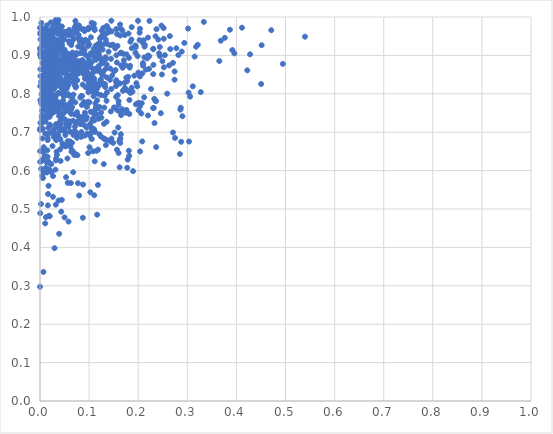
| Category | Series 0 |
|---|---|
| 0.02709339771973407 | 0.755 |
| 0.02919782494659373 | 0.9 |
| 0.019098560578344803 | 0.898 |
| 0.009769669985578378 | 0.853 |
| 0.12694486622733547 | 0.849 |
| 0.12307414921914317 | 0.835 |
| 0.05187580481836729 | 0.699 |
| 0.0022544420249364094 | 0.776 |
| 0.014412276318506612 | 0.884 |
| 0.16867731172009504 | 0.808 |
| 0.102453721973088 | 0.544 |
| 0.06273196589625474 | 0.779 |
| 0.11403467699599146 | 0.889 |
| 0.16303013367379726 | 0.827 |
| 0.04923019206028134 | 0.822 |
| 0.0565354215919146 | 0.568 |
| 0.13341325776617863 | 0.895 |
| 0.0028744440868859744 | 0.786 |
| 0.034628058617515944 | 0.884 |
| 0.01051965445953651 | 0.853 |
| 0.014802896093945916 | 0.867 |
| 0.24424519701399017 | 0.898 |
| 0.049699672776679193 | 0.805 |
| 0.2818783786407679 | 0.901 |
| 0.005272598988521171 | 0.848 |
| 0.16453571070721262 | 0.97 |
| 0.02339808887279604 | 0.902 |
| 0.05923938166201559 | 0.728 |
| 0.3958550662742336 | 0.905 |
| 0.02424673691549739 | 0.855 |
| 0.16982489682673674 | 0.874 |
| 0.01177397462870966 | 0.968 |
| 0.09064904564124887 | 0.914 |
| 0.05516373010496556 | 0.953 |
| 0.046722606790103205 | 0.87 |
| 0.09391386826680914 | 0.843 |
| 0.11403406665059812 | 0.765 |
| 0.12900729912132014 | 0.972 |
| 0.08857768157685264 | 0.881 |
| 0.14549971681441365 | 0.683 |
| 0.01333966573535672 | 0.859 |
| 0.007949702283796656 | 0.908 |
| 0.0959710604056705 | 0.899 |
| 0.27086380161296086 | 0.699 |
| 0.00374830509983215 | 0.737 |
| 0.28487046675355554 | 0.643 |
| 0.4503471412212373 | 0.825 |
| 0.10743712231293934 | 0.854 |
| 0.038036861424385005 | 0.845 |
| 0.07078637719848757 | 0.885 |
| 0.1007132603645099 | 0.778 |
| 0.17736096485620223 | 0.833 |
| 0.026894716689953246 | 0.772 |
| 0.03548337598382856 | 0.851 |
| 0.16962406557791643 | 0.904 |
| 0.11553414027931241 | 0.86 |
| 0.1015999415002663 | 0.691 |
| 0.21253644545633243 | 0.895 |
| 0.07391978848538605 | 0.85 |
| 0.0845984090116989 | 0.724 |
| 0.029700350001178988 | 0.898 |
| 0.10903925143601623 | 0.704 |
| 0.09038472342998616 | 0.718 |
| 0.022991745536764974 | 0.617 |
| 0.12108606961137625 | 0.766 |
| 0.03996931809558324 | 0.726 |
| 0.07388829661105345 | 0.725 |
| 0.03381276415761858 | 0.902 |
| 0.01056363269838878 | 0.947 |
| 0.11244391041751833 | 0.759 |
| 0.00807088202543349 | 0.805 |
| 0.004454347206124698 | 0.586 |
| 0.017082843750759635 | 0.712 |
| 0.06862340452647353 | 0.896 |
| 0.25427476648973246 | 0.901 |
| 0.037690040714096096 | 0.522 |
| 0.029038508561477605 | 0.888 |
| 0.01600131932279958 | 0.509 |
| 0.045391085861709146 | 0.749 |
| 0.09764095079667601 | 0.898 |
| 0.02300322932754484 | 0.856 |
| 0.0446568582827962 | 0.813 |
| 0.0019734494989177565 | 0.513 |
| 0.04453008149617166 | 0.765 |
| 0.01700265546580948 | 0.89 |
| 0.005869579046529738 | 0.817 |
| 0.18022641442579024 | 0.808 |
| 0.1944894272839217 | 0.921 |
| 0.10557470591370188 | 0.883 |
| 0.20270340491844352 | 0.94 |
| 0.0050459204705853855 | 0.709 |
| 0.06587121334364221 | 0.781 |
| 0.15477638942081717 | 0.82 |
| 0.08470826978790424 | 0.907 |
| 0.11390256887812245 | 0.81 |
| 0.016196968992961303 | 0.906 |
| 0.08705719581973681 | 0.88 |
| 0.05513013464794625 | 0.877 |
| 0.05885069029413792 | 0.937 |
| 0.08756361393717249 | 0.852 |
| 0.09806014049819634 | 0.646 |
| 0.0067272354843167514 | 0.759 |
| 0.057238353285699706 | 0.824 |
| 0.009192570064351813 | 0.966 |
| 0.059502164738279406 | 0.966 |
| 0.07534926135534759 | 0.752 |
| 0.23639949203860755 | 0.781 |
| 0.17978934719367679 | 0.844 |
| 0.1159467073414574 | 0.745 |
| 0.17698629067385363 | 0.842 |
| 0.01142279762359999 | 0.856 |
| 0.03537704236919892 | 0.86 |
| 0.15084241546552113 | 0.859 |
| 0.2348958595460886 | 0.782 |
| 0.10624879417559108 | 0.904 |
| 0.07320256288935367 | 0.979 |
| 0.064142124352224 | 0.649 |
| 0.04073545414227575 | 0.719 |
| 0.025934082896891808 | 0.955 |
| 0.1952756957422872 | 0.773 |
| 0.08866826369455383 | 0.968 |
| 0.11136248338954013 | 0.702 |
| 0.05575956068798271 | 0.866 |
| 0.03210561250418986 | 0.84 |
| 0.09102841615203039 | 0.865 |
| 0.03287739888305308 | 0.721 |
| 0.015323609051449139 | 0.926 |
| 0.12504693454790472 | 0.738 |
| 0.15703592363890295 | 0.955 |
| 0.09571157450755508 | 0.878 |
| 0.16005637529451067 | 0.646 |
| 0.135557828814579 | 0.68 |
| 0.07196666055258527 | 0.84 |
| 0.05396406990952585 | 0.859 |
| 0.19878749460028367 | 0.898 |
| 0.12776567435685193 | 0.85 |
| 0.025545147831883663 | 0.926 |
| 0.07608283009363981 | 0.726 |
| 0.0993627729828348 | 0.829 |
| 0.02779937079461192 | 0.706 |
| 0.044256081879416986 | 0.935 |
| 0.02233566029229117 | 0.843 |
| 0.002902472250138066 | 0.9 |
| 0.07535289470632467 | 0.685 |
| 0.23095146209303052 | 0.875 |
| 0.02171194679929145 | 0.966 |
| 0.06997643677023635 | 0.897 |
| 0.012983071209530794 | 0.798 |
| 0.39167593084401675 | 0.914 |
| 0.04748955918112552 | 0.832 |
| 0.061282649015659385 | 0.891 |
| 0.024463820533095815 | 0.786 |
| 0.047153984557974926 | 0.874 |
| 0.1634378259734216 | 0.672 |
| 0.011391869426940038 | 0.868 |
| 0.00875364551193114 | 0.903 |
| 0.10245532067245122 | 0.843 |
| 0.11701104156235753 | 0.8 |
| 0.014613772436301464 | 0.773 |
| 0.04218848180281454 | 0.732 |
| 0.07871978293561499 | 0.946 |
| 0.026896284386595304 | 0.968 |
| 0.047910001735920416 | 0.895 |
| 0.08451043152157456 | 0.941 |
| 0.0004762309273289578 | 0.623 |
| 0.01401704103309187 | 0.875 |
| 0.026717580712363742 | 0.879 |
| 0.08662566885183354 | 0.909 |
| 0.0814573542076642 | 0.935 |
| 0.005984844108365972 | 0.581 |
| 0.04849625251990142 | 0.75 |
| 0.12310331122857154 | 0.92 |
| 0.10376278036117981 | 0.947 |
| 0.02762009746051286 | 0.873 |
| 0.008171291106429557 | 0.765 |
| 0.0003830557164284931 | 0.651 |
| 0.10934157746435125 | 0.917 |
| 0.0032693160283081557 | 0.626 |
| 0.1116516426069647 | 0.701 |
| 0.006822371386673298 | 0.817 |
| 0.013517685364670351 | 0.746 |
| 0.0040831788626432 | 0.756 |
| 0.16390957970039965 | 0.906 |
| 0.031144977761504933 | 0.754 |
| 0.1128277870076686 | 0.775 |
| 0.2750023943006509 | 0.685 |
| 0.11172464177711694 | 0.829 |
| 0.03299953266138489 | 0.966 |
| 0.09853511172845353 | 0.804 |
| 0.12114279175383258 | 0.897 |
| 0.009370115806859425 | 0.84 |
| 0.4514378632409034 | 0.927 |
| 0.04140547492061675 | 0.968 |
| 0.020328067251049853 | 0.953 |
| 0.05308074975839516 | 0.583 |
| 0.029966940993220503 | 0.854 |
| 0.11497108817404922 | 0.652 |
| 0.16249154336158922 | 0.681 |
| 0.16310459936063126 | 0.98 |
| 0.1096957384986611 | 0.807 |
| 0.00826117152222594 | 0.897 |
| 0.03652842870684958 | 0.981 |
| 0.03630361705942653 | 0.969 |
| 0.1299284697361257 | 0.617 |
| 0.14458862687883434 | 0.891 |
| 0.17228618773225024 | 0.829 |
| 0.021057375567435144 | 0.898 |
| 0.0992690261563548 | 0.972 |
| 0.2094886471288222 | 0.933 |
| 0.12017819032476396 | 0.822 |
| 0.00928980486923825 | 0.932 |
| 0.031137383421602993 | 0.942 |
| 0.08450235274150764 | 0.794 |
| 0.020623037796756005 | 0.777 |
| 0.04698044515210975 | 0.782 |
| 0.15657125902022462 | 0.881 |
| 0.23655585679478597 | 0.661 |
| 0.20367486126073675 | 0.969 |
| 0.150687148662631 | 0.764 |
| 0.025207901913848474 | 0.882 |
| 0.10356217121716282 | 0.823 |
| 0.04472172235324756 | 0.927 |
| 0.002162105901878042 | 0.831 |
| 0.1097348378571068 | 0.982 |
| 0.02675643121113702 | 0.974 |
| 0.1084988386249589 | 0.84 |
| 0.05876332223891312 | 0.795 |
| 0.21093428465155217 | 0.939 |
| 0.12427730241827817 | 0.89 |
| 0.12514429754392375 | 0.826 |
| 0.03274885911274006 | 0.836 |
| 0.008777755551125477 | 0.87 |
| 0.42788189063574134 | 0.903 |
| 0.04605095771266943 | 0.776 |
| 0.1647216051079431 | 0.695 |
| 0.19445978871954073 | 0.907 |
| 0.03052801578276021 | 0.794 |
| 0.10007731612370607 | 0.814 |
| 0.006079977489984123 | 0.829 |
| 0.07166564063172476 | 0.905 |
| 0.007482914526719675 | 0.957 |
| 0.11983941724217106 | 0.905 |
| 0.10053623690225921 | 0.825 |
| 0.0230278953463412 | 0.748 |
| 0.1310159947867926 | 0.764 |
| 0.06289468613489624 | 0.758 |
| 0.01574046683059771 | 0.746 |
| 0.010422696695496225 | 0.741 |
| 0.183974630956101 | 0.802 |
| 0.0757850151231233 | 0.904 |
| 0.03742779227375781 | 0.927 |
| 0.04633208895201124 | 0.664 |
| 0.1574109981594548 | 0.757 |
| 0.16749464036643447 | 0.76 |
| 0.09477333541057498 | 0.868 |
| 0.06517635078437323 | 0.672 |
| 0.04756810853105797 | 0.854 |
| 0.015548781462295214 | 0.685 |
| 0.06764139352430876 | 0.596 |
| 0.1652889372539743 | 0.874 |
| 0.04367630436674852 | 0.828 |
| 0.020000754072235116 | 0.857 |
| 0.11802916325767643 | 0.563 |
| 0.183420828859583 | 0.873 |
| 0.035880523931559605 | 0.962 |
| 0.20820645556034068 | 0.676 |
| 0.05823021245952442 | 0.845 |
| 0.010987344733312865 | 0.784 |
| 0.02212080884717338 | 0.792 |
| 0.3058028122891864 | 0.793 |
| 0.01836364406153712 | 0.815 |
| 0.06820262220974693 | 0.693 |
| 0.20964772845167134 | 0.873 |
| 0.07982804541511923 | 0.941 |
| 0.14344012070357082 | 0.926 |
| 0.07272001345869938 | 0.859 |
| 0.27762655542122716 | 0.919 |
| 0.09770945516404006 | 0.924 |
| 0.051195558452035606 | 0.893 |
| 0.03926856237198462 | 0.83 |
| 0.02692392018900558 | 0.937 |
| 0.01960809994311785 | 0.759 |
| 0.008378144411616217 | 0.95 |
| 0.010574553136691867 | 0.697 |
| 0.08217081282094674 | 0.79 |
| 0.1744680664146705 | 0.81 |
| 0.017125377142443332 | 0.818 |
| 0.0595795637966271 | 0.962 |
| 0.013303734559156122 | 0.842 |
| 0.014377777664437152 | 0.866 |
| 0.07854691384047219 | 0.953 |
| 0.012870026505556131 | 0.762 |
| 0.18212174506078238 | 0.784 |
| 0.0179732412439082 | 0.935 |
| 0.021442983562636964 | 0.699 |
| 0.10232502485136352 | 0.883 |
| 0.011507426121673991 | 0.727 |
| 0.030268702295828565 | 0.912 |
| 0.12021061025742386 | 0.873 |
| 0.0516793639480535 | 0.692 |
| 0.17761350073652604 | 0.607 |
| 0.024749338689628808 | 0.858 |
| 0.007773907713249151 | 0.861 |
| 0.05930120191637556 | 0.721 |
| 0.09314670168714045 | 0.817 |
| 0.20030297427207178 | 0.855 |
| 0.05043496187058616 | 0.829 |
| 0.03803277173152109 | 0.913 |
| 0.13968900362993952 | 0.91 |
| 0.03287083139273239 | 0.797 |
| 0.0006179422217065245 | 0.82 |
| 0.07573139664923412 | 0.697 |
| 0.16826219946607557 | 0.868 |
| 0.0077547124770220854 | 0.661 |
| 0.13958279295921572 | 0.968 |
| 0.0007247169922326435 | 0.784 |
| 0.15670476741655315 | 0.655 |
| 0.04342294526765178 | 0.742 |
| 0.029181822968134763 | 0.931 |
| 0.2133622165443062 | 0.927 |
| 0.045119386576799814 | 0.886 |
| 0.09085740424367894 | 0.963 |
| 0.056974085930369234 | 0.903 |
| 0.006996106950427405 | 0.952 |
| 0.057503599676998585 | 0.826 |
| 0.005257564412823323 | 0.709 |
| 0.1862440298489194 | 0.941 |
| 0.17275870723151743 | 0.953 |
| 0.03171965219897055 | 0.793 |
| 0.06726570956764832 | 0.873 |
| 0.1598775092714324 | 0.771 |
| 0.03361585180119486 | 0.834 |
| 0.08678726853650953 | 0.968 |
| 0.050790269663401943 | 0.734 |
| 0.1635126156884391 | 0.952 |
| 0.2939596263331655 | 0.932 |
| 0.0008043677764947299 | 0.864 |
| 0.051251282754213645 | 0.819 |
| 0.007786657398885732 | 0.841 |
| 0.022073951819260418 | 0.776 |
| 0.0025120384859361744 | 0.722 |
| 0.0403909615640029 | 0.706 |
| 0.31494356516320776 | 0.897 |
| 0.12752416447266124 | 0.915 |
| 0.03335623485322581 | 0.846 |
| 0.03885282761477005 | 0.742 |
| 0.07283972895951496 | 0.722 |
| 0.042585631311772176 | 0.889 |
| 0.08772786825973877 | 0.564 |
| 0.018019834938132306 | 0.805 |
| 0.032178011155283404 | 0.875 |
| 0.074611402176886 | 0.834 |
| 0.12593403395236846 | 0.882 |
| 0.1432002419357632 | 0.866 |
| 0.02408893644186383 | 0.85 |
| 0.0009657550883159782 | 0.846 |
| 0.01599414955732914 | 0.912 |
| 0.03549161421057945 | 0.931 |
| 0.01170579331889643 | 0.909 |
| 0.06728696900618647 | 0.73 |
| 0.04286523204969139 | 0.857 |
| 0.0026341085473692294 | 0.903 |
| 0.007335480213925938 | 0.797 |
| 0.04357387916014055 | 0.911 |
| 0.07165759032826435 | 0.849 |
| 0.15542604463015697 | 0.969 |
| 0.005886002264764989 | 0.65 |
| 0.09536219630759557 | 0.877 |
| 0.059533822847407825 | 0.9 |
| 0.05082046403749341 | 0.796 |
| 0.026396134123419457 | 0.532 |
| 0.013686950149945809 | 0.621 |
| 0.20294865680015584 | 0.959 |
| 0.010645693002356627 | 0.923 |
| 0.057136002831421284 | 0.848 |
| 0.026067510312482556 | 0.795 |
| 0.0895481800761635 | 0.743 |
| 0.005364795007273493 | 0.94 |
| 0.11257300289051075 | 0.746 |
| 0.056347485715674384 | 0.883 |
| 0.016255088994314493 | 0.938 |
| 0.1359067272408433 | 0.876 |
| 0.05249788932932076 | 0.723 |
| 0.007489939289082814 | 0.879 |
| 0.18679958860137624 | 0.974 |
| 0.1086573148963893 | 0.975 |
| 0.10506092466123429 | 0.711 |
| 0.05763821958235238 | 0.823 |
| 0.03352186789812517 | 0.924 |
| 0.035608075005697626 | 0.821 |
| 0.2867136222959805 | 0.764 |
| 0.039112766779364816 | 0.94 |
| 0.010012416234684851 | 0.742 |
| 0.1753632766421227 | 0.753 |
| 0.09157737383844888 | 0.751 |
| 0.066307609768953 | 0.652 |
| 0.10910128640550487 | 0.827 |
| 0.23060104410100268 | 0.851 |
| 0.01496985661666983 | 0.763 |
| 0.00593828480096914 | 0.809 |
| 0.10025499190621634 | 0.888 |
| 0.03206443549189397 | 0.714 |
| 0.13636667145432713 | 0.804 |
| 0.20390151058035233 | 0.65 |
| 0.051958590257192294 | 0.86 |
| 0.003565938076421249 | 0.743 |
| 0.03812201267469162 | 0.683 |
| 0.17442310806571615 | 0.751 |
| 0.028476994522586896 | 0.687 |
| 0.0065196218632027625 | 0.813 |
| 0.06625866082431309 | 0.907 |
| 0.010358656658919774 | 0.875 |
| 0.11844804118507879 | 0.655 |
| 0.012790480602598353 | 0.802 |
| 0.11746311668748655 | 0.928 |
| 0.2875732492574602 | 0.675 |
| 0.2741985158423417 | 0.858 |
| 0.07643839045259004 | 0.859 |
| 0.046374119379700485 | 0.749 |
| 0.005318032732056999 | 0.934 |
| 0.06218522417982819 | 0.662 |
| 0.03766835420856507 | 0.757 |
| 0.03601597685401081 | 0.987 |
| 0.13276233037722518 | 0.818 |
| 0.08322611816707404 | 0.793 |
| 0.07963579073863669 | 0.535 |
| 0.06530543576389225 | 0.851 |
| 0.17076471255871006 | 0.887 |
| 0.04852343588748931 | 0.892 |
| 0.007013027049329712 | 0.336 |
| 0.16171716402594216 | 0.676 |
| 0.018987999752430373 | 0.842 |
| 0.028490140315448165 | 0.7 |
| 0.13670007044010346 | 0.93 |
| 0.008570764789868623 | 0.864 |
| 0.1740873222025351 | 0.874 |
| 0.3026413169234802 | 0.803 |
| 0.1304119661852936 | 0.956 |
| 0.08935707095877576 | 0.778 |
| 0.019175969961189643 | 0.944 |
| 0.1549540232643586 | 0.792 |
| 0.1963310601521402 | 0.828 |
| 0.10815144875544236 | 0.865 |
| 0.12564964250602662 | 0.964 |
| 0.06895137900265158 | 0.943 |
| 0.08600518037225202 | 0.888 |
| 0.1442243105435166 | 0.754 |
| 0.004976222681291942 | 0.684 |
| 0.07425676952024785 | 0.885 |
| 0.0256727996068149 | 0.789 |
| 0.21296692903221204 | 0.923 |
| 0.303543675523701 | 0.676 |
| 0.11640446753629652 | 0.485 |
| 0.08549520120252041 | 0.794 |
| 0.025487106540431403 | 0.947 |
| 0.12408516807741221 | 0.797 |
| 0.0015734476523167062 | 0.896 |
| 0.03445244906885225 | 0.641 |
| 0.07075945545824991 | 0.88 |
| 0.1240315988329923 | 0.838 |
| 0.11870532549900203 | 0.867 |
| 0.08169875070420018 | 0.721 |
| 0.015439632880574039 | 0.961 |
| 0.07101938699637267 | 0.746 |
| 0.09606112938235789 | 0.969 |
| 0.007422111084135374 | 0.595 |
| 0.03343606065800886 | 0.686 |
| 0.21822187033757157 | 0.892 |
| 0.12763544290245443 | 0.827 |
| 0.06117182416254596 | 0.9 |
| 0.13587981473022137 | 0.843 |
| 0.00680837309168858 | 0.836 |
| 0.03284558729954179 | 0.863 |
| 0.004129320574412398 | 0.942 |
| 0.015929291830642733 | 0.858 |
| 0.11040506319646437 | 0.84 |
| 0.23062707876489974 | 0.916 |
| 0.04978620844713 | 0.915 |
| 0.016370827085055994 | 0.539 |
| 0.14584604535848233 | 0.962 |
| 0.08371986337621062 | 0.688 |
| 0.10548657980593135 | 0.985 |
| 0.11143723374656977 | 0.966 |
| 0.01697752611955483 | 0.855 |
| 0.11006734035472365 | 0.804 |
| 0.10890503659941841 | 0.794 |
| 0.17861940283647215 | 0.629 |
| 0.07714650243723586 | 0.853 |
| 0.12937122188205208 | 0.885 |
| 0.044482485527768234 | 0.705 |
| 0.18672474563547603 | 0.816 |
| 0.049000143139165675 | 0.902 |
| 0.04895618828591897 | 0.942 |
| 0.09736583736406146 | 0.779 |
| 0.0002086409149185675 | 0.709 |
| 0.032224953150626345 | 0.511 |
| 0.10310441357160582 | 0.753 |
| 0.058343555610306574 | 0.755 |
| 0.26527426832627754 | 0.917 |
| 0.11947092669094861 | 0.916 |
| 0.046427130409213646 | 0.868 |
| 0.11065523006510902 | 0.97 |
| 0.0628563375226664 | 0.568 |
| 0.015504609873109532 | 0.636 |
| 0.15318695111412206 | 0.918 |
| 0.11376349506762085 | 0.866 |
| 0.03710106132713753 | 0.694 |
| 0.0033155606722186093 | 0.773 |
| 0.15930254245404996 | 0.712 |
| 0.13559874330529786 | 0.727 |
| 0.07738748061246092 | 0.567 |
| 0.0072026363475236055 | 0.793 |
| 0.024340047573608525 | 0.963 |
| 0.06448303757712404 | 0.935 |
| 0.0003181325277197278 | 0.919 |
| 0.060892439398455456 | 0.701 |
| 0.05411999786402333 | 0.843 |
| 0.08489403008328589 | 0.721 |
| 0.10204301410260808 | 0.721 |
| 0.07736591269250659 | 0.863 |
| 0.01883177906475575 | 0.82 |
| 0.13182573529379793 | 0.795 |
| 0.2708218764316198 | 0.881 |
| 0.03151802780619273 | 0.893 |
| 0.029732938516332075 | 0.777 |
| 0.023376511574846437 | 0.596 |
| 0.0679159125671609 | 0.702 |
| 0.009554890296923135 | 0.64 |
| 0.33370336041338755 | 0.987 |
| 0.008479886805057957 | 0.809 |
| 0.25213824141252617 | 0.943 |
| 0.2887356785278269 | 0.91 |
| 0.18028317903762603 | 0.957 |
| 0.022937649627089773 | 0.844 |
| 0.12919641439413743 | 0.929 |
| 0.5396570800021636 | 0.949 |
| 0.05797172150098029 | 0.848 |
| 0.08209871364840671 | 0.861 |
| 0.023428130638069256 | 0.887 |
| 0.14890969329222092 | 0.672 |
| 0.13025127798214864 | 0.722 |
| 0.31112784431728524 | 0.819 |
| 0.05088600126067533 | 0.961 |
| 0.05961220564777514 | 0.831 |
| 0.0032763122393196786 | 0.798 |
| 0.09461727755967853 | 0.877 |
| 0.03791180818078066 | 0.957 |
| 0.0337143088108931 | 0.649 |
| 0.01972620450406648 | 0.807 |
| 0.08693296192163191 | 0.824 |
| 0.038890774090617364 | 0.922 |
| 0.03499555458349923 | 0.885 |
| 0.007823675176188316 | 0.829 |
| 0.04135940640853586 | 0.682 |
| 0.011607182798688997 | 0.83 |
| 0.16032250601574405 | 0.827 |
| 0.22249562185441896 | 0.898 |
| 0.017960961478733828 | 0.775 |
| 0.004331584009620415 | 0.967 |
| 0.20970361818296834 | 0.88 |
| 0.19457521758227747 | 0.924 |
| 0.1484007654367484 | 0.928 |
| 0.10258195722778873 | 0.9 |
| 0.03815799167923084 | 0.873 |
| 0.27404743797629416 | 0.837 |
| 0.11348135267827175 | 0.925 |
| 0.10939845375623547 | 0.835 |
| 0.008995964424581726 | 0.759 |
| 0.06110589697920632 | 0.676 |
| 0.027334075734523955 | 0.878 |
| 0.3213516854817333 | 0.928 |
| 0.05640980892732861 | 0.677 |
| 0.026610851208327513 | 0.772 |
| 0.09405289724944033 | 0.771 |
| 0.09594250466302734 | 0.855 |
| 0.10062221312124409 | 0.876 |
| 0.053100196325124416 | 0.867 |
| 0.035818420269379425 | 0.871 |
| 0.04575819828724126 | 0.767 |
| 0.20030234904858457 | 0.777 |
| 0.028130707556350942 | 0.899 |
| 0.0005711898458551357 | 0.489 |
| 0.003958575511900597 | 0.801 |
| 0.03759615349262313 | 0.992 |
| 0.03471560763168924 | 0.766 |
| 0.011924920734743494 | 0.607 |
| 0.022287438110776714 | 0.799 |
| 0.02660025222700435 | 0.81 |
| 0.06649421123888577 | 0.949 |
| 0.005016951950854054 | 0.82 |
| 0.13959249981790822 | 0.96 |
| 0.22622566128554855 | 0.812 |
| 0.23731622269352326 | 0.968 |
| 0.05838231542088956 | 0.714 |
| 0.012264293006326699 | 0.739 |
| 0.047595431983418646 | 0.899 |
| 0.054897901927410064 | 0.771 |
| 0.0821953673753727 | 0.906 |
| 0.13413418909833164 | 0.941 |
| 0.0971492662639093 | 0.937 |
| 0.38679693263458226 | 0.967 |
| 0.1650860997772552 | 0.745 |
| 0.09769117844240627 | 0.839 |
| 0.01736614001983039 | 0.56 |
| 0.17623832769285885 | 0.758 |
| 0.03894966107074904 | 0.435 |
| 0.01658582474322301 | 0.696 |
| 0.03667503337201783 | 0.93 |
| 0.06807854159232307 | 0.798 |
| 0.21996484435422525 | 0.946 |
| 0.1425422288185222 | 0.836 |
| 0.018655473704160985 | 0.603 |
| 0.3178652138308905 | 0.923 |
| 0.1233422525938963 | 0.945 |
| 0.10346652624462505 | 0.906 |
| 0.1452026786763948 | 0.813 |
| 0.07384816007816353 | 0.903 |
| 0.15851339492625183 | 0.797 |
| 0.008377596159139578 | 0.863 |
| 0.004198309500190178 | 0.773 |
| 0.05975637360782726 | 0.954 |
| 0.024180027752906508 | 0.749 |
| 0.051053110022362236 | 0.863 |
| 0.18829449121066155 | 0.806 |
| 0.29007988376569205 | 0.742 |
| 0.19961520340488537 | 0.99 |
| 0.07209974464478797 | 0.99 |
| 0.0752775884770468 | 0.836 |
| 0.13553221122071923 | 0.782 |
| 0.09250122480544898 | 0.941 |
| 0.1123811239673217 | 0.908 |
| 0.06148790510895652 | 0.668 |
| 0.030683607532028256 | 0.894 |
| 0.08977874802788444 | 0.734 |
| 0.03313859204112035 | 0.679 |
| 0.09970492074652704 | 0.969 |
| 0.13008592024560606 | 0.683 |
| 0.07623330948334717 | 0.64 |
| 0.012136140827675113 | 0.814 |
| 0.07978199850679513 | 0.969 |
| 0.07113902054449006 | 0.715 |
| 0.05037684695172018 | 0.799 |
| 0.036543334868740174 | 0.835 |
| 0.09609233398196404 | 0.696 |
| 0.18094591820927064 | 0.652 |
| 0.02836290610534775 | 0.883 |
| 0.06663873182878066 | 0.844 |
| 0.18162291771857964 | 0.638 |
| 0.050719928679435755 | 0.911 |
| 0.42215286846515077 | 0.861 |
| 0.06167622241187454 | 0.869 |
| 0.004866747617702449 | 0.929 |
| 0.022124741656177283 | 0.81 |
| 0.23166545334904542 | 0.763 |
| 0.09450367902668133 | 0.862 |
| 0.016927270461678634 | 0.624 |
| 0.04570824596578926 | 0.671 |
| 0.18959352111705452 | 0.599 |
| 0.06372052161677733 | 0.927 |
| 0.01829705229231071 | 0.482 |
| 0.0144750720070147 | 0.834 |
| 0.00217892650175322 | 0.605 |
| 0.014505560351995017 | 0.782 |
| 0.04191369231930797 | 0.625 |
| 0.08217753334863998 | 0.971 |
| 0.024976883782381276 | 0.856 |
| 0.18696319627782243 | 0.919 |
| 0.131681758549003 | 0.682 |
| 0.010636631164009147 | 0.463 |
| 0.04100918193847647 | 0.842 |
| 0.111999445095461 | 0.894 |
| 0.49453633543015507 | 0.878 |
| 0.009974482478318225 | 0.886 |
| 0.11634548810139544 | 0.762 |
| 0.06539849434440015 | 0.765 |
| 0.2629963231621756 | 0.874 |
| 0.0779731775593745 | 0.885 |
| 0.47099469691183626 | 0.966 |
| 0.11959684740267651 | 0.735 |
| 0.049480941920730825 | 0.829 |
| 0.0075626815578380135 | 0.899 |
| 0.23520744466605836 | 0.95 |
| 0.08773959013389043 | 0.885 |
| 0.1166367283561649 | 0.815 |
| 0.04688394805061458 | 0.871 |
| 0.03141511671071506 | 0.603 |
| 0.05805803228775697 | 0.467 |
| 0.07925817132127089 | 0.978 |
| 0.08385873478914829 | 0.92 |
| 0.1323198022190898 | 0.825 |
| 0.1600020408154389 | 0.781 |
| 0.015122728330381197 | 0.921 |
| 0.05182536808412841 | 0.76 |
| 0.14529490517522003 | 0.99 |
| 0.26448656967166495 | 0.95 |
| 0.06642198533989474 | 0.9 |
| 0.036919016323594955 | 0.753 |
| 0.25904813465352106 | 0.8 |
| 0.21000877862207723 | 0.876 |
| 0.11767488836045703 | 0.907 |
| 0.03843106842730604 | 0.801 |
| 0.0853778125718081 | 0.771 |
| 0.16800721954309228 | 0.965 |
| 0.029630048051568103 | 0.398 |
| 0.03020383943188798 | 0.985 |
| 0.1627414162014107 | 0.754 |
| 0.12922555156287108 | 0.859 |
| 0.13488468703253653 | 0.958 |
| 0.0949323142415156 | 0.739 |
| 0.1244872841435235 | 0.751 |
| 0.1004660806046257 | 0.846 |
| 0.03385779527151922 | 0.865 |
| 0.1324140658551245 | 0.89 |
| 0.044510609449053606 | 0.975 |
| 0.0005433550022071465 | 0.915 |
| 0.021802182414406013 | 0.833 |
| 0.19206333429882205 | 0.847 |
| 0.014686969147965745 | 0.935 |
| 0.039929256038423455 | 0.777 |
| 0.03245605506055471 | 0.87 |
| 0.05673008892228237 | 0.962 |
| 0.18125015235666997 | 0.894 |
| 0.029882983072616498 | 0.868 |
| 0.21583500904657882 | 0.863 |
| 0.134750983699357 | 0.892 |
| 0.029635207214284698 | 0.815 |
| 0.05147076397424699 | 0.889 |
| 0.21992201310089277 | 0.743 |
| 0.026796246605567786 | 0.944 |
| 0.06045441511007099 | 0.866 |
| 0.06997909960911008 | 0.852 |
| 0.09170755037500489 | 0.903 |
| 0.036760192426790406 | 0.802 |
| 0.017300777020664238 | 0.794 |
| 0.17632924260589566 | 0.903 |
| 0.2200732846799468 | 0.9 |
| 0.08899317223020942 | 0.774 |
| 0.00014108078512897748 | 0.902 |
| 0.021475081841692667 | 0.822 |
| 0.0408832835046361 | 0.655 |
| 0.10992575973232765 | 0.708 |
| 0.02935252635012009 | 0.907 |
| 0.1083794093593452 | 0.75 |
| 0.07369948854872943 | 0.819 |
| 0.008255223140427037 | 0.796 |
| 0.07778802217659864 | 0.853 |
| 0.14351482524841153 | 0.676 |
| 0.08009929141280658 | 0.737 |
| 0.0036399476650005314 | 0.626 |
| 0.2121543632478745 | 0.791 |
| 0.08630721624749127 | 0.86 |
| 0.04264142218295497 | 0.951 |
| 0.01706159522844597 | 0.75 |
| 0.2220562074285496 | 0.865 |
| 0.0011090391439819713 | 0.942 |
| 0.07296168509127021 | 0.643 |
| 0.005846344716475382 | 0.97 |
| 0.03227969537634956 | 0.784 |
| 0.18665527141017924 | 0.804 |
| 0.0026617727125453072 | 0.984 |
| 0.04979556428697629 | 0.71 |
| 0.04323863721730459 | 0.493 |
| 0.03459694756306353 | 0.899 |
| 0.15493794451040233 | 0.831 |
| 0.10549326479717513 | 0.682 |
| 0.020429577934280574 | 0.802 |
| 0.08648339903905722 | 0.92 |
| 0.005374883194746993 | 0.927 |
| 0.08418665691786698 | 0.701 |
| 0.018786244943656882 | 0.756 |
| 0.12151945216720361 | 0.827 |
| 0.11141864527535694 | 0.624 |
| 0.10227196834193675 | 0.877 |
| 0.017589548814813782 | 0.873 |
| 0.13095970558431091 | 0.951 |
| 0.01496753462267586 | 0.799 |
| 0.12132435169610778 | 0.933 |
| 0.023192228487166178 | 0.866 |
| 0.02216169372706034 | 0.879 |
| 0.07094111079042975 | 0.822 |
| 0.02727069341501398 | 0.928 |
| 0.05179432329661282 | 0.905 |
| 0.04258499360805135 | 0.77 |
| 0.041554680448939396 | 0.721 |
| 0.054515445818329455 | 0.888 |
| 0.019849845888963435 | 0.922 |
| 0.3681821908307624 | 0.938 |
| 0.025567837730724907 | 0.873 |
| 0.06574087061068123 | 0.651 |
| 0.05414811636154704 | 0.841 |
| 0.01426155285258246 | 0.978 |
| 0.0053530530783094665 | 0.738 |
| 0.1003090872525304 | 0.928 |
| 0.04687228768194107 | 0.772 |
| 0.23058842469796814 | 0.917 |
| 0.020603930866675113 | 0.952 |
| 0.11059823806908031 | 0.749 |
| 0.013447581581336299 | 0.792 |
| 0.03210745138952675 | 0.888 |
| 0.08187139957440182 | 0.731 |
| 0.0996882083215801 | 0.851 |
| 0.1072049885147166 | 0.829 |
| 0.13429793906094956 | 0.865 |
| 0.06632438386761053 | 0.843 |
| 0.03602006868438057 | 0.882 |
| 0.10412614145866061 | 0.869 |
| 0.001546123825394985 | 0.971 |
| 0.07789370946604202 | 0.743 |
| 0.010713424815127048 | 0.968 |
| 0.12091560594186401 | 0.694 |
| 0.18204797371058 | 0.747 |
| 0.03963370045364867 | 0.884 |
| 0.18252743700387553 | 0.868 |
| 0.03754614074597262 | 0.917 |
| 0.01395326435715627 | 0.828 |
| 0.10431342473689276 | 0.713 |
| 0.032606858083334966 | 0.882 |
| 0.03473805361932647 | 0.932 |
| 0.006497380666603991 | 0.63 |
| 0.0910666419266769 | 0.691 |
| 8.824941851948154e-06 | 0.298 |
| 0.0010827029577276104 | 0.955 |
| 0.018337231579109603 | 0.83 |
| 0.04952702882989757 | 0.914 |
| 0.04122769759744238 | 0.771 |
| 0.0206058234437545 | 0.813 |
| 0.1638274021406163 | 0.684 |
| 0.006742661492080693 | 0.879 |
| 0.04829728883985007 | 0.961 |
| 0.12708574108991055 | 0.88 |
| 0.05478069481096859 | 0.864 |
| 0.2492897703774235 | 0.885 |
| 0.1093199289589577 | 0.805 |
| 0.3016624459551983 | 0.97 |
| 0.20072335583375012 | 0.757 |
| 0.029644675461023784 | 0.692 |
| 0.1044571244144541 | 0.7 |
| 0.15380545275631896 | 0.862 |
| 0.06935873243810509 | 0.838 |
| 0.01770502968393539 | 0.765 |
| 0.20352649460743855 | 0.767 |
| 0.025457622968571125 | 0.664 |
| 0.044058934942725836 | 0.836 |
| 0.07082875420682455 | 0.969 |
| 0.059507128350015814 | 0.903 |
| 0.004672039627213964 | 0.97 |
| 0.2229937942211736 | 0.99 |
| 0.07006134492509553 | 0.965 |
| 0.06983707798908956 | 0.64 |
| 0.051828093353090576 | 0.665 |
| 0.04428455739200665 | 0.821 |
| 0.03385327561261575 | 0.824 |
| 0.19418144814623695 | 0.926 |
| 0.2517752247420073 | 0.971 |
| 0.10802447308407559 | 0.65 |
| 0.03240652597963478 | 0.627 |
| 0.03621162799047095 | 0.957 |
| 0.06032538545400756 | 0.932 |
| 0.3651858269506395 | 0.885 |
| 0.16503341419772077 | 0.907 |
| 0.009346919161445144 | 0.886 |
| 0.02237116484644397 | 0.781 |
| 0.06656593151698187 | 0.847 |
| 0.055310741931534846 | 0.824 |
| 0.07675176015077945 | 0.744 |
| 0.04425860926311487 | 0.884 |
| 0.07695762922407134 | 0.726 |
| 0.03171116276201125 | 0.776 |
| 0.02385104555597084 | 0.915 |
| 0.1256574827614806 | 0.95 |
| 0.07156241882199099 | 0.703 |
| 0.03152172625056904 | 0.992 |
| 0.010484428345524432 | 0.948 |
| 0.0204725609290346 | 0.831 |
| 0.0133162445133308 | 0.836 |
| 0.06307804685310059 | 0.879 |
| 0.05775887406208158 | 0.799 |
| 0.0779498940358937 | 0.923 |
| 0.0973867481167946 | 0.847 |
| 7.29149119997885e-05 | 0.972 |
| 0.002457201437209844 | 0.903 |
| 0.001656398714895091 | 0.651 |
| 0.042729469831408906 | 0.873 |
| 0.12448092097199293 | 0.689 |
| 0.055970549182450924 | 0.889 |
| 0.014987677048099668 | 0.653 |
| 0.052261434739959145 | 0.663 |
| 0.01567514029593997 | 0.68 |
| 0.11117176613158442 | 0.731 |
| 0.012628891564735012 | 0.735 |
| 0.010474036684601007 | 0.874 |
| 0.12302547128459407 | 0.857 |
| 0.2327400544798015 | 0.787 |
| 0.06537727494992873 | 0.861 |
| 0.07206589686059639 | 0.778 |
| 0.14679685883325022 | 0.847 |
| 0.061870015404698164 | 0.957 |
| 0.01808478324480145 | 0.804 |
| 0.03192073378395954 | 0.892 |
| 0.05209022732347657 | 0.882 |
| 0.06362626293965334 | 0.748 |
| 0.09729340939462883 | 0.969 |
| 0.05308909689614738 | 0.894 |
| 0.06852366386802589 | 0.829 |
| 0.20721292480934161 | 0.776 |
| 0.0750333605037824 | 0.906 |
| 0.04523772672335369 | 0.953 |
| 0.053931793188521704 | 0.814 |
| 0.05407784307628272 | 0.888 |
| 0.05418760175899762 | 0.87 |
| 0.01905146455838702 | 0.957 |
| 0.05000138565115497 | 0.478 |
| 0.04814630012651411 | 0.915 |
| 0.056323320921616626 | 0.763 |
| 0.01984011525310614 | 0.481 |
| 0.03542009687835446 | 0.901 |
| 0.32743727857509364 | 0.804 |
| 0.018651764065667042 | 0.791 |
| 0.0114510736073693 | 0.868 |
| 0.0009423969072491767 | 0.907 |
| 0.41134187735307404 | 0.972 |
| 0.03769482454883988 | 0.905 |
| 0.005328847593745856 | 0.881 |
| 0.05434299130637865 | 0.814 |
| 0.1007841270960127 | 0.661 |
| 0.022357558270376887 | 0.871 |
| 0.027899901860141352 | 0.901 |
| 0.1091887249164254 | 0.814 |
| 0.09221016818399841 | 0.84 |
| 0.11656880935605385 | 0.783 |
| 0.08569282654162391 | 0.866 |
| 0.008330731970349392 | 0.9 |
| 0.07270082120194654 | 0.962 |
| 0.08722586177339664 | 0.477 |
| 0.019817971137395585 | 0.827 |
| 0.07529445170398652 | 0.835 |
| 0.10677103495934093 | 0.73 |
| 0.09485615583828477 | 0.712 |
| 0.021428193720986588 | 0.618 |
| 0.09638427473006006 | 0.848 |
| 0.18415994600907548 | 0.936 |
| 0.023418723916633466 | 0.907 |
| 0.011821980457404235 | 0.935 |
| 0.28605363078527213 | 0.759 |
| 0.04909408273933957 | 0.881 |
| 0.23321566731831733 | 0.724 |
| 0.0719753277431564 | 0.868 |
| 0.09739250285916745 | 0.774 |
| 0.05214850673649196 | 0.884 |
| 0.24253990063056052 | 0.905 |
| 0.02893966278956195 | 0.827 |
| 0.04261197908123049 | 0.935 |
| 0.07832692031107247 | 0.873 |
| 0.09529555114968391 | 0.766 |
| 0.2065064899036536 | 0.749 |
| 0.1728727552858853 | 0.815 |
| 0.06248648019205061 | 0.777 |
| 0.24397404845074333 | 0.922 |
| 0.05873379472780538 | 0.841 |
| 0.0194951170454275 | 0.74 |
| 0.24729072924160078 | 0.978 |
| 0.022031662480573866 | 0.986 |
| 0.2084601823994997 | 0.853 |
| 0.02094852221628718 | 0.965 |
| 0.008067895732528974 | 0.793 |
| 0.3764592761389174 | 0.946 |
| 0.027982381916643706 | 0.861 |
| 0.0824288046642665 | 0.872 |
| 0.10730485292676117 | 0.735 |
| 0.0027970537870143364 | 0.825 |
| 0.019925727120254533 | 0.76 |
| 0.06934230841768996 | 0.856 |
| 0.1105378182563268 | 0.536 |
| 0.16212416841423216 | 0.609 |
| 0.08743704102640892 | 0.739 |
| 0.2408363139891525 | 0.941 |
| 0.021636161342294624 | 0.786 |
| 0.020909654962773305 | 0.718 |
| 0.19809634185522484 | 0.82 |
| 0.1552733004949134 | 0.836 |
| 0.23042705649552264 | 0.763 |
| 0.05589512553105114 | 0.632 |
| 0.025176691678679863 | 0.79 |
| 7.535520222179404e-05 | 0.706 |
| 0.1221540167393863 | 0.944 |
| 0.044466648962743216 | 0.524 |
| 0.13614554504989185 | 0.977 |
| 0.13415477321952363 | 0.666 |
| 0.24615173620609887 | 0.749 |
| 0.08811547737163528 | 0.932 |
| 0.03294402022028986 | 0.632 |
| 0.04825760815670144 | 0.794 |
| 0.030097061250376922 | 0.912 |
| 0.0010884721200136172 | 0.725 |
| 0.17587347787418495 | 0.842 |
| 0.0006068878728213711 | 0.959 |
| 0.2523630020406621 | 0.869 |
| 0.07254656490587741 | 0.816 |
| 0.1027619442502209 | 0.809 |
| 0.013729605078795393 | 0.764 |
| 0.012082860400708828 | 0.479 |
| 0.11412456710612628 | 0.816 |
| 0.20357405074602275 | 0.845 |
| 0.03962285527930476 | 0.709 |
| 0.015014190848949616 | 0.826 |
| 0.15194829261735954 | 0.699 |
| 0.09097559517388087 | 0.966 |
| 0.15559975299883533 | 0.9 |
| 0.00751479130179844 | 0.76 |
| 0.01992317371334329 | 0.719 |
| 0.09356627016179175 | 0.733 |
| 0.02651343653017013 | 0.586 |
| 0.02721565449549168 | 0.766 |
| 0.12169014372712483 | 0.859 |
| 0.013250264884695495 | 0.914 |
| 0.24831005992442978 | 0.85 |
| 0.046339181136131224 | 0.8 |
| 0.06589233402811867 | 0.789 |
| 0.1578180968595928 | 0.925 |
| 0.07386905112320752 | 0.959 |
| 0.07043914394979744 | 0.973 |
| 0.1037515221841443 | 0.808 |
| 0.029364962544148998 | 0.755 |
| 0.029908312164357298 | 0.86 |
| 0.007217344702828976 | 0.777 |
| 0.014315120192397113 | 0.595 |
| 0.09198086514708692 | 0.839 |
| 0.0045243743078675625 | 0.731 |
| 0.07529411360281335 | 0.878 |